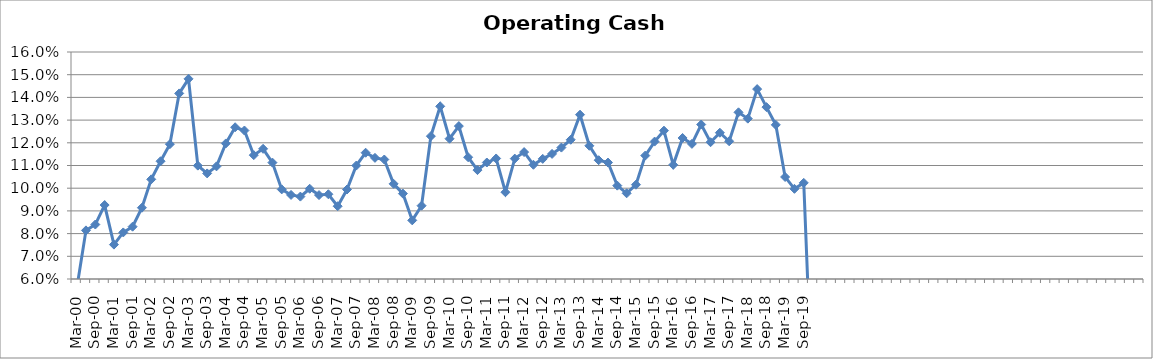
| Category | Operating Cash Margin |
|---|---|
| Mar-00 | 0.056 |
| Jun-00 | 0.081 |
| Sep-00 | 0.084 |
| Dec-00 | 0.093 |
| Mar-01 | 0.075 |
| Jun-01 | 0.081 |
| Sep-01 | 0.083 |
| Dec-01 | 0.091 |
| Mar-02 | 0.104 |
| Jun-02 | 0.112 |
| Sep-02 | 0.119 |
| Dec-02 | 0.142 |
| Mar-03 | 0.148 |
| Jun-03 | 0.11 |
| Sep-03 | 0.107 |
| Dec-03 | 0.11 |
| Mar-04 | 0.12 |
| Jun-04 | 0.127 |
| Sep-04 | 0.125 |
| Dec-04 | 0.115 |
| Mar-05 | 0.117 |
| Jun-05 | 0.111 |
| Sep-05 | 0.099 |
| Dec-05 | 0.097 |
| Mar-06 | 0.096 |
| Jun-06 | 0.1 |
| Sep-06 | 0.097 |
| Dec-06 | 0.097 |
| Mar-07 | 0.092 |
| Jun-07 | 0.099 |
| Sep-07 | 0.11 |
| Dec-07 | 0.116 |
| Mar-08 | 0.113 |
| Jun-08 | 0.113 |
| Sep-08 | 0.102 |
| Dec-08 | 0.098 |
| Mar-09 | 0.086 |
| Jun-09 | 0.092 |
| Sep-09 | 0.123 |
| Dec-09 | 0.136 |
| Mar-10 | 0.122 |
| Jun-10 | 0.127 |
| Sep-10 | 0.114 |
| Dec-10 | 0.108 |
| Mar-11 | 0.111 |
| Jun-11 | 0.113 |
| Sep-11 | 0.098 |
| Dec-11 | 0.113 |
| Mar-12 | 0.116 |
| Jun-12 | 0.11 |
| Sep-12 | 0.113 |
| Dec-12 | 0.115 |
| Mar-13 | 0.118 |
| Jun-13 | 0.121 |
| Sep-13 | 0.132 |
| Dec-13 | 0.119 |
| Mar-14 | 0.112 |
| Jun-14 | 0.111 |
| Sep-14 | 0.101 |
| Dec-14 | 0.098 |
| Mar-15 | 0.102 |
| Jun-15 | 0.114 |
| Sep-15 | 0.121 |
| Dec-15 | 0.125 |
| Mar-16 | 0.11 |
| Jun-16 | 0.122 |
| Sep-16 | 0.12 |
| Dec-16 | 0.128 |
| Mar-17 | 0.12 |
| Jun-17 | 0.124 |
| Sep-17 | 0.121 |
| Dec-17 | 0.133 |
| Mar-18 | 0.131 |
| Jun-18 | 0.144 |
| Sep-18 | 0.136 |
| Dec-18 | 0.128 |
| Mar-19 | 0.105 |
| Jun-19 | 0.1 |
| Sep-19 | 0.102 |